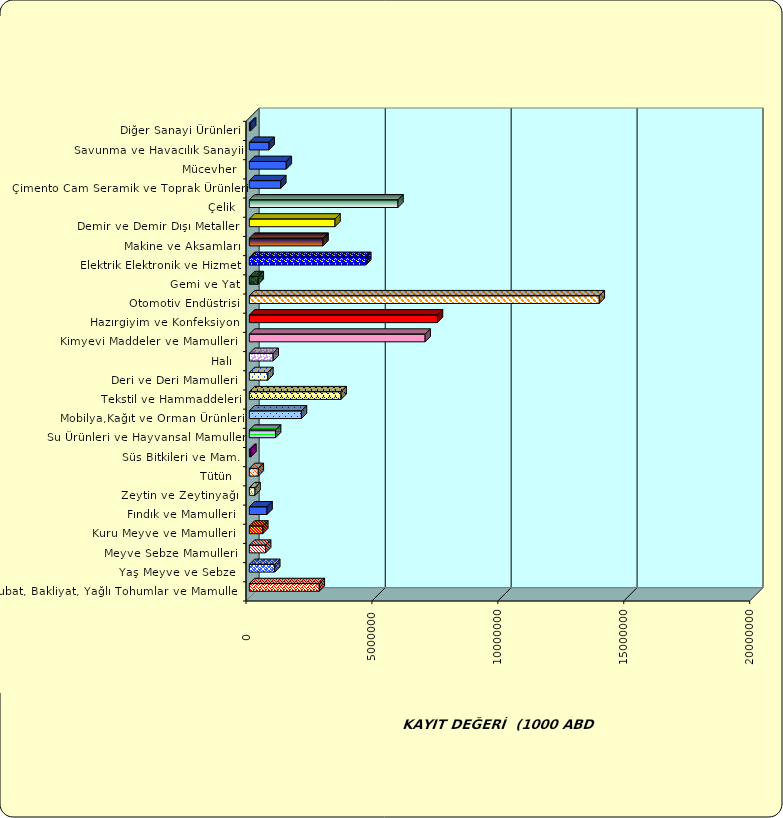
| Category | Series 0 |
|---|---|
|  Hububat, Bakliyat, Yağlı Tohumlar ve Mamulleri  | 2776860.415 |
|  Yaş Meyve ve Sebze   | 1008040.73 |
|  Meyve Sebze Mamulleri  | 645233.07 |
|  Kuru Meyve ve Mamulleri   | 533687.709 |
|  Fındık ve Mamulleri  | 702521.795 |
|  Zeytin ve Zeytinyağı  | 225107.084 |
|  Tütün  | 354177.138 |
|  Süs Bitkileri ve Mam. | 60298.059 |
|  Su Ürünleri ve Hayvansal Mamuller | 1041494.906 |
|  Mobilya,Kağıt ve Orman Ürünleri | 2067968.403 |
|  Tekstil ve Hammaddeleri | 3641631.97 |
|  Deri ve Deri Mamulleri  | 734965.565 |
|  Halı  | 944955.94 |
|  Kimyevi Maddeler ve Mamulleri   | 6979733.17 |
|  Hazırgiyim ve Konfeksiyon  | 7469165.264 |
|  Otomotiv Endüstrisi | 13894364.51 |
|  Gemi ve Yat | 354418.286 |
|  Elektrik Elektronik ve Hizmet | 4623509.41 |
|  Makine ve Aksamları | 2924703.857 |
|  Demir ve Demir Dışı Metaller  | 3401348.931 |
|  Çelik | 5901557.277 |
|  Çimento Cam Seramik ve Toprak Ürünleri | 1248026.244 |
|  Mücevher | 1466797.901 |
|  Savunma ve Havacılık Sanayii | 784527.761 |
|  Diğer Sanayi Ürünleri | 51666.473 |